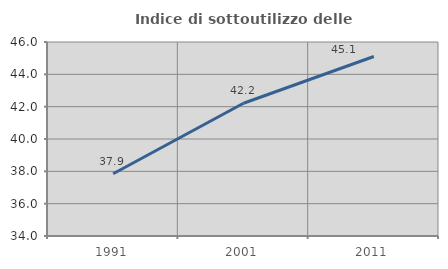
| Category | Indice di sottoutilizzo delle abitazioni  |
|---|---|
| 1991.0 | 37.853 |
| 2001.0 | 42.213 |
| 2011.0 | 45.104 |